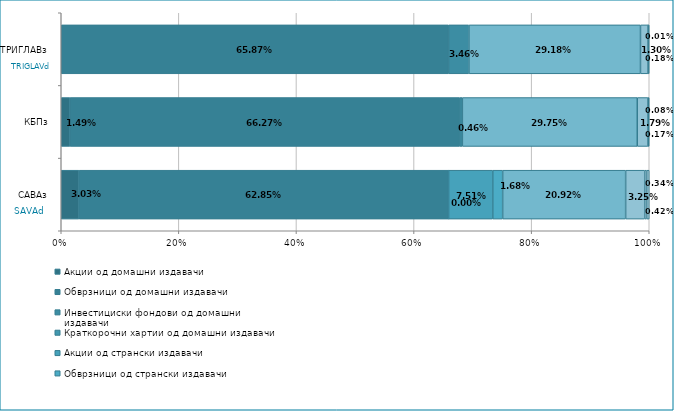
| Category | Акции од домашни издавачи  | Обврзници од домашни издавачи  | Инвестициски фондови од домашни издавачи  | Краткорочни хартии од домашни издавачи  | Акции од странски издавачи  | Обврзници од странски издавачи  | Инвестициски фондови од странски издавaчи | Краткорочни хартии од странски издавачи  | Депозити  | Парични средства  | Побарувања |
|---|---|---|---|---|---|---|---|---|---|---|---|
| САВАз | 0.03 | 0.628 | 0 | 0 | 0.075 | 0.017 | 0.209 | 0 | 0.032 | 0.003 | 0.004 |
| КБПз | 0.015 | 0.663 | 0.005 | 0 | 0 | 0 | 0.297 | 0 | 0.018 | 0.001 | 0.002 |
| ТРИГЛАВз | 0 | 0.659 | 0.035 | 0 | 0 | 0 | 0.292 | 0 | 0.013 | 0 | 0.002 |